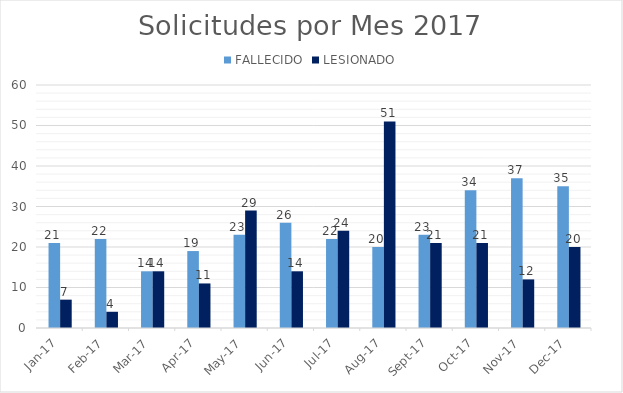
| Category | FALLECIDO | LESIONADO |
|---|---|---|
| 2017-01-01 | 21 | 7 |
| 2017-02-01 | 22 | 4 |
| 2017-03-01 | 14 | 14 |
| 2017-04-01 | 19 | 11 |
| 2017-05-01 | 23 | 29 |
| 2017-06-01 | 26 | 14 |
| 2017-07-01 | 22 | 24 |
| 2017-08-01 | 20 | 51 |
| 2017-09-01 | 23 | 21 |
| 2017-10-01 | 34 | 21 |
| 2017-11-01 | 37 | 12 |
| 2017-12-01 | 35 | 20 |